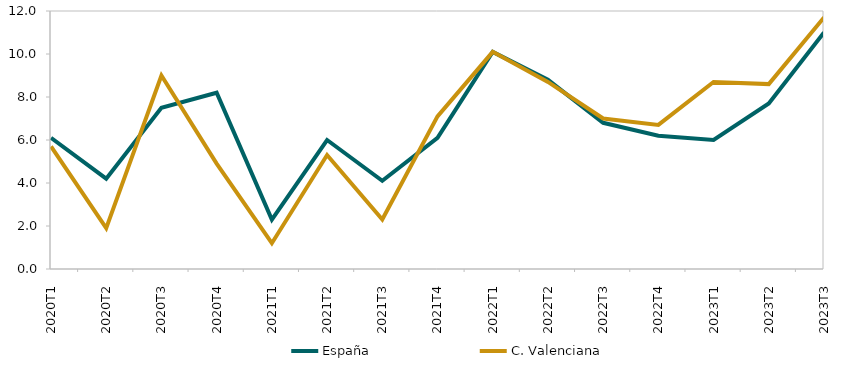
| Category | España | C. Valenciana |
|---|---|---|
| 2020T1 | 6.1 | 5.7 |
| 2020T2 | 4.2 | 1.9 |
| 2020T3 | 7.5 | 9 |
| 2020T4 | 8.2 | 4.9 |
| 2021T1 | 2.3 | 1.2 |
| 2021T2 | 6 | 5.3 |
| 2021T3 | 4.1 | 2.3 |
| 2021T4 | 6.1 | 7.1 |
| 2022T1 | 10.1 | 10.1 |
| 2022T2 | 8.8 | 8.7 |
| 2022T3 | 6.8 | 7 |
| 2022T4 | 6.2 | 6.7 |
| 2023T1 | 6 | 8.7 |
| 2023T2 | 7.7 | 8.6 |
| 2023T3 | 11 | 11.7 |